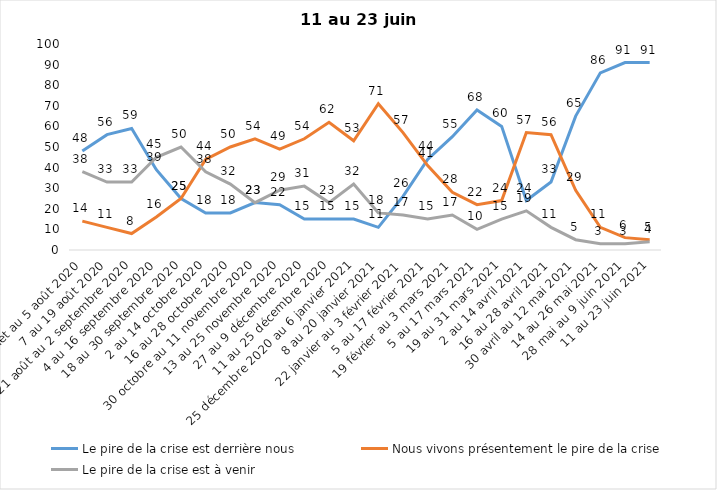
| Category | Le pire de la crise est derrière nous | Nous vivons présentement le pire de la crise | Le pire de la crise est à venir |
|---|---|---|---|
| 24 juillet au 5 août 2020 | 48 | 14 | 38 |
| 7 au 19 août 2020 | 56 | 11 | 33 |
| 21 août au 2 septembre 2020 | 59 | 8 | 33 |
| 4 au 16 septembre 2020 | 39 | 16 | 45 |
| 18 au 30 septembre 2020 | 25 | 25 | 50 |
| 2 au 14 octobre 2020 | 18 | 44 | 38 |
| 16 au 28 octobre 2020 | 18 | 50 | 32 |
| 30 octobre au 11 novembre 2020 | 23 | 54 | 23 |
| 13 au 25 novembre 2020 | 22 | 49 | 29 |
| 27 au 9 décembre 2020 | 15 | 54 | 31 |
| 11 au 25 décembre 2020 | 15 | 62 | 23 |
| 25 décembre 2020 au 6 janvier 2021 | 15 | 53 | 32 |
| 8 au 20 janvier 2021 | 11 | 71 | 18 |
| 22 janvier au 3 février 2021 | 26 | 57 | 17 |
| 5 au 17 février 2021 | 44 | 41 | 15 |
| 19 février au 3 mars 2021 | 55 | 28 | 17 |
| 5 au 17 mars 2021 | 68 | 22 | 10 |
| 19 au 31 mars 2021 | 60 | 24 | 15 |
| 2 au 14 avril 2021 | 24 | 57 | 19 |
| 16 au 28 avril 2021 | 33 | 56 | 11 |
| 30 avril au 12 mai 2021 | 65 | 29 | 5 |
| 14 au 26 mai 2021 | 86 | 11 | 3 |
| 28 mai au 9 juin 2021 | 91 | 6 | 3 |
| 11 au 23 juin 2021 | 91 | 5 | 4 |